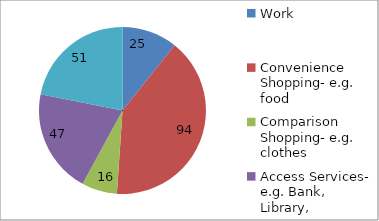
| Category | Series 0 | Series 1 |
|---|---|---|
| Work | 25 | 25 |
| Convenience Shopping- e.g. food | 94 | 94 |
| Comparison Shopping- e.g. clothes | 16 | 16 |
| Access Services- e.g. Bank, Library, | 47 | 47 |
| Leisure- e.g. sightseeing, eat, drink, go to the gym | 51 | 51 |